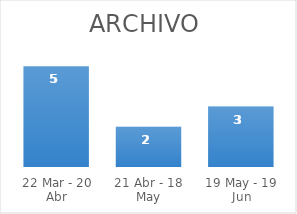
| Category | Series 0 |
|---|---|
| 22 Mar - 20 Abr | 5 |
| 21 Abr - 18 May | 2 |
| 19 May - 19 Jun | 3 |